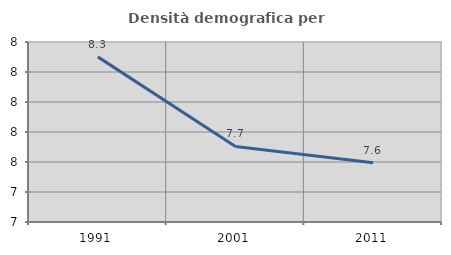
| Category | Densità demografica |
|---|---|
| 1991.0 | 8.301 |
| 2001.0 | 7.704 |
| 2011.0 | 7.596 |